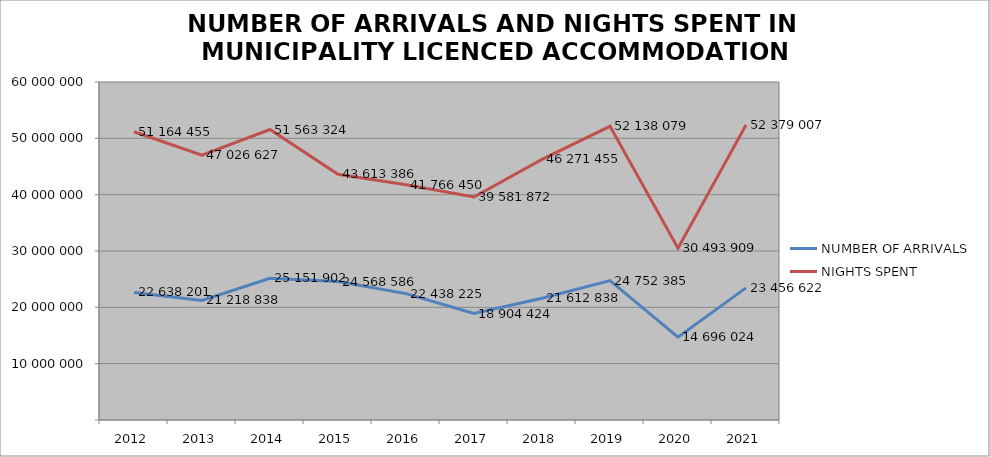
| Category | NUMBER OF ARRIVALS | NIGHTS SPENT |
|---|---|---|
| 2012 | 22638201 | 51164455 |
| 2013 | 21218838 | 47026627 |
| 2014 | 25151902 | 51563324 |
| 2015 | 24568586 | 43613386 |
| 2016 | 22438225 | 41766450 |
| 2017 | 18904424 | 39581872 |
| 2018 | 21612838 | 46271455 |
| 2019 | 24752385 | 52138079 |
| 2020 | 14696024 | 30493909 |
| 2021 | 23456622 | 52379007 |